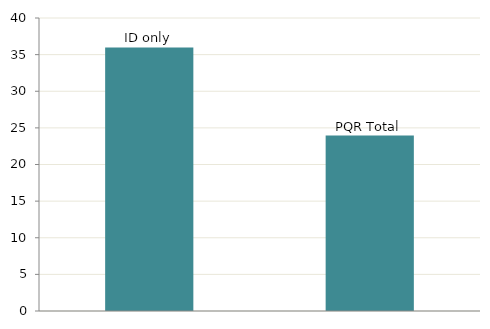
| Category | Series 0 |
|---|---|
| PQR Total | 23.947 |
| ID only | 35.977 |